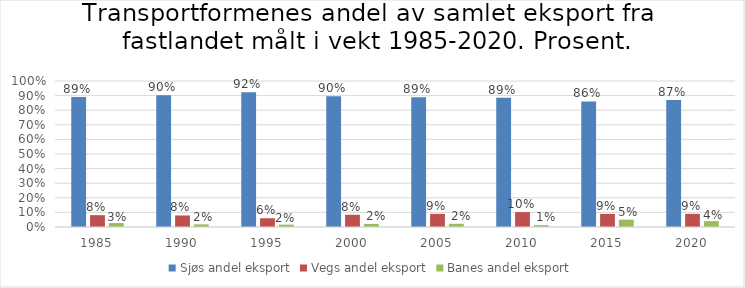
| Category | Sjøs andel eksport | Vegs andel eksport | Banes andel eksport |
|---|---|---|---|
| 1985.0 | 0.891 | 0.081 | 0.027 |
| 1990.0 | 0.903 | 0.079 | 0.018 |
| 1995.0 | 0.923 | 0.06 | 0.016 |
| 2000.0 | 0.896 | 0.084 | 0.021 |
| 2005.0 | 0.888 | 0.09 | 0.022 |
| 2010.0 | 0.885 | 0.102 | 0.013 |
| 2015.0 | 0.86 | 0.09 | 0.05 |
| 2020.0 | 0.87 | 0.09 | 0.04 |